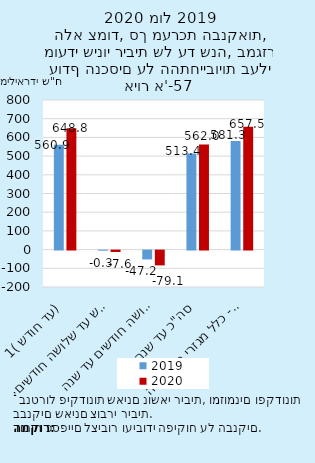
| Category | 2019 | 2020 |
|---|---|---|
| עד חודש (1) | 560.949 | 648.763 |
| חודש עד שלושה חודשים | -0.292 | -7.646 |
| שלושה חודשים עד שנה | -47.226 | -79.073 |
| סה"כ עד שנה | 513.431 | 562.044 |
| סה"כ עד שנה- כלל מגזרי ההצמדה | 581.342 | 657.467 |